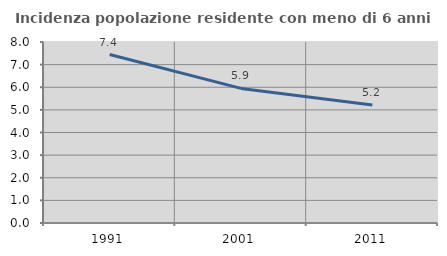
| Category | Incidenza popolazione residente con meno di 6 anni |
|---|---|
| 1991.0 | 7.447 |
| 2001.0 | 5.949 |
| 2011.0 | 5.216 |